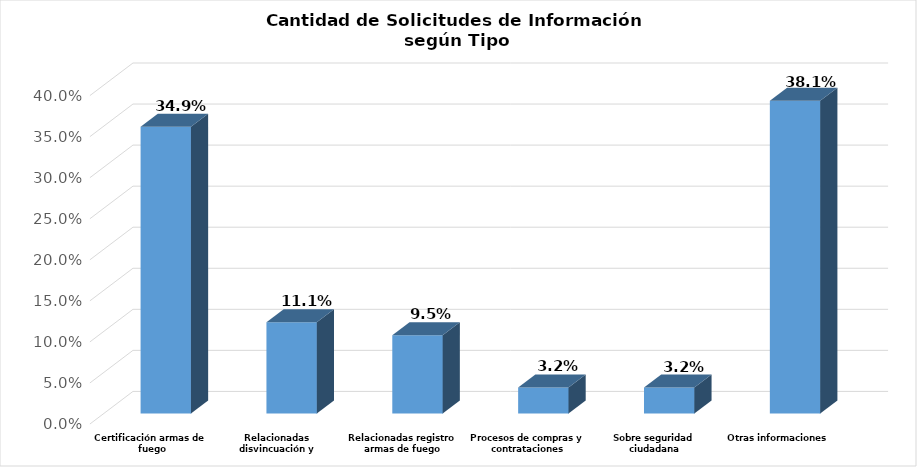
| Category | Series 0 |
|---|---|
| Certificación armas de fuego | 0.349 |
| Relacionadas disvincuación y prestaciones laborales | 0.111 |
| Relacionadas registro armas de fuego | 0.095 |
| Procesos de compras y contrataciones | 0.032 |
| Sobre seguridad ciudadana | 0.032 |
| Otras informaciones | 0.381 |